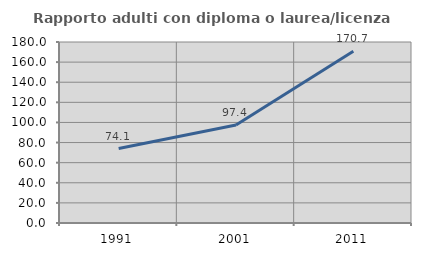
| Category | Rapporto adulti con diploma o laurea/licenza media  |
|---|---|
| 1991.0 | 74.051 |
| 2001.0 | 97.436 |
| 2011.0 | 170.718 |